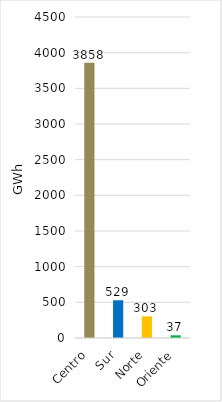
| Category | Series 0 |
|---|---|
| Centro | 3858.067 |
| Sur | 528.905 |
| Norte | 302.941 |
| Oriente | 37.447 |